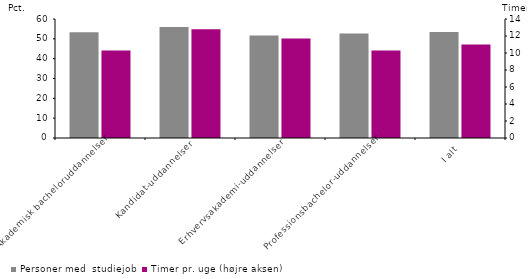
| Category | Personer med  studiejob | Formatering |
|---|---|---|
| Akademisk bacheloruddannelser | 53.3 | 0 |
| Kandidat-uddannelser | 56 | 0 |
| Erhvervsakademi-uddannelser | 51.7 | 0 |
| Professionsbachelor-uddannelser | 52.7 | 0 |
| I alt | 53.5 | 0 |